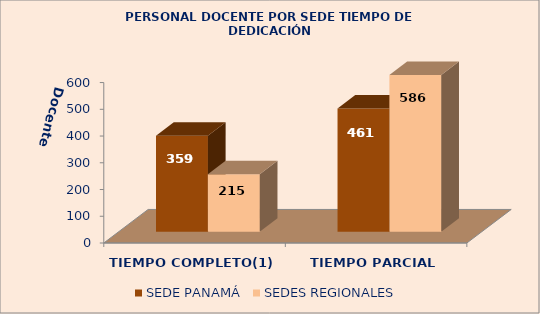
| Category | SEDE PANAMÁ | SEDES REGIONALES |
|---|---|---|
| TIEMPO COMPLETO(1) | 359 | 215 |
| TIEMPO PARCIAL | 461 | 586 |